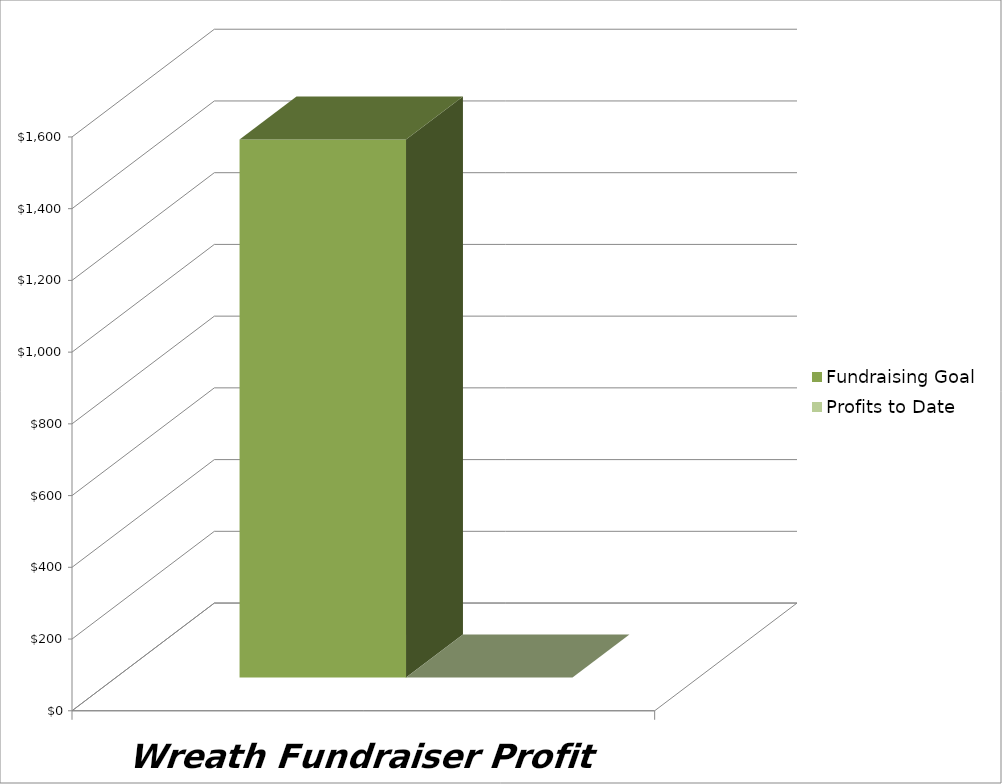
| Category | Fundraising Goal | Profits to Date |
|---|---|---|
| 0 | 1500 | 0 |